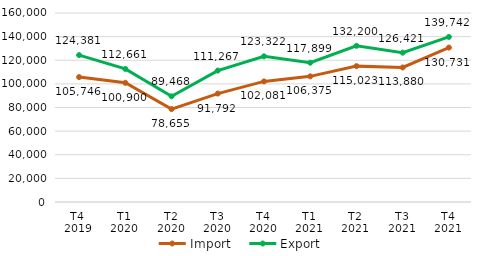
| Category | Import | Export |
|---|---|---|
| T4 
2019 | 105746.413 | 124381.053 |
| T1
2020 | 100899.706 | 112660.733 |
| T2
2020 | 78655.118 | 89468.132 |
| T3
2020 | 91792.247 | 111267.087 |
| T4
2020 | 102081.279 | 123321.887 |
| T1
2021 | 106375.017 | 117898.949 |
| T2
2021 | 115023.114 | 132200.24 |
| T3
2021 | 113879.752 | 126421.009 |
| T4
2021 | 130730.594 | 139741.555 |